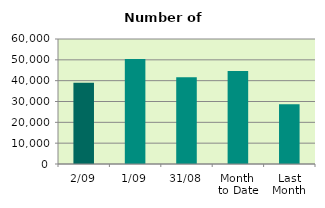
| Category | Series 0 |
|---|---|
| 2/09 | 38970 |
| 1/09 | 50354 |
| 31/08 | 41588 |
| Month 
to Date | 44662 |
| Last
Month | 28637.636 |